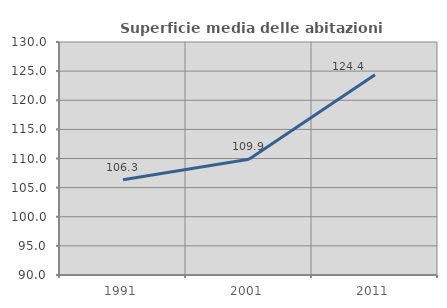
| Category | Superficie media delle abitazioni occupate |
|---|---|
| 1991.0 | 106.34 |
| 2001.0 | 109.859 |
| 2011.0 | 124.386 |